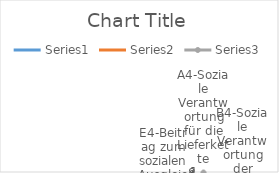
| Category | Series 0 | Series 1 | Series 2 |
|---|---|---|---|
| A4-Soziale Verantwortung für die Lieferkette | 0 | 0 | 10 |
| B4-Soziale Verantwortung der Finanzpolitik | 0 | 0 | 10 |
| C4-Gerechte Verteilung von Arbeit | 0 | 0 | 10 |
| D4-Soziale Gestaltung der öffentlichen Leistung | 0 | 0 | 10 |
| E4-Beitrag zum sozialen Ausgleich | 0 | 0 | 10 |